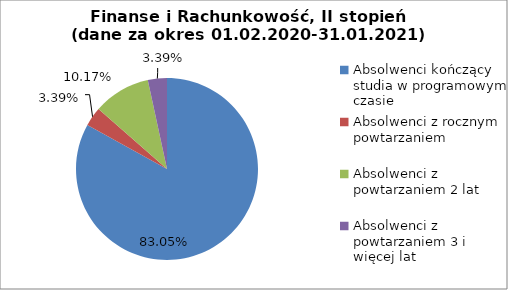
| Category | Series 0 |
|---|---|
| Absolwenci kończący studia w programowym czasie | 83.051 |
| Absolwenci z rocznym powtarzaniem | 3.39 |
| Absolwenci z powtarzaniem 2 lat | 10.169 |
| Absolwenci z powtarzaniem 3 i więcej lat | 3.39 |